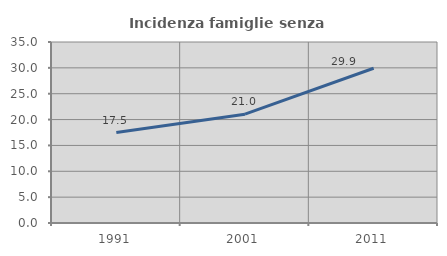
| Category | Incidenza famiglie senza nuclei |
|---|---|
| 1991.0 | 17.493 |
| 2001.0 | 21.04 |
| 2011.0 | 29.923 |